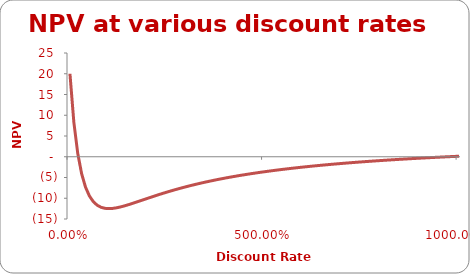
| Category | NPV |
|---|---|
| 0.0 | 20000 |
| 0.1 | 8343.351 |
| 0.2 | 833.333 |
| 0.30000000000000004 | -4080.564 |
| 0.4 | -7317.784 |
| 0.5 | -9444.444 |
| 0.6 | -10820.313 |
| 0.7 | -11680.236 |
| 0.7999999999999999 | -12181.07 |
| 0.8999999999999999 | -12429.654 |
| 0.9999999999999999 | -12500 |
| 1.0999999999999999 | -12444.121 |
| 1.2 | -12299.023 |
| 1.3 | -12091.313 |
| 1.4000000000000001 | -11840.278 |
| 1.5000000000000002 | -11560 |
| 1.6000000000000003 | -11260.81 |
| 1.7000000000000004 | -10950.312 |
| 1.8000000000000005 | -10634.111 |
| 1.9000000000000006 | -10316.331 |
| 2.0000000000000004 | -10000 |
| 2.1000000000000005 | -9687.322 |
| 2.2000000000000006 | -9379.883 |
| 2.3000000000000007 | -9078.805 |
| 2.400000000000001 | -8784.857 |
| 2.500000000000001 | -8498.542 |
| 2.600000000000001 | -8220.165 |
| 2.700000000000001 | -7949.875 |
| 2.800000000000001 | -7687.71 |
| 2.9000000000000012 | -7433.622 |
| 3.0000000000000013 | -7187.5 |
| 3.1000000000000014 | -6949.188 |
| 3.2000000000000015 | -6718.497 |
| 3.3000000000000016 | -6495.214 |
| 3.4000000000000017 | -6279.113 |
| 3.5000000000000018 | -6069.959 |
| 3.600000000000002 | -5867.51 |
| 3.700000000000002 | -5671.528 |
| 3.800000000000002 | -5481.771 |
| 3.900000000000002 | -5298.005 |
| 4.000000000000002 | -5120 |
| 4.100000000000001 | -4947.531 |
| 4.200000000000001 | -4780.382 |
| 4.300000000000001 | -4618.343 |
| 4.4 | -4461.21 |
| 4.5 | -4308.79 |
| 4.6 | -4160.897 |
| 4.699999999999999 | -4017.349 |
| 4.799999999999999 | -3877.978 |
| 4.899999999999999 | -3742.617 |
| 4.999999999999998 | -3611.111 |
| 5.099999999999998 | -3483.309 |
| 5.1999999999999975 | -3359.068 |
| 5.299999999999997 | -3238.251 |
| 5.399999999999997 | -3120.728 |
| 5.4999999999999964 | -3006.372 |
| 5.599999999999996 | -2895.066 |
| 5.699999999999996 | -2786.696 |
| 5.799999999999995 | -2681.152 |
| 5.899999999999995 | -2578.331 |
| 5.999999999999995 | -2478.134 |
| 6.099999999999994 | -2380.466 |
| 6.199999999999994 | -2285.237 |
| 6.299999999999994 | -2192.359 |
| 6.399999999999993 | -2101.751 |
| 6.499999999999993 | -2013.333 |
| 6.5999999999999925 | -1927.03 |
| 6.699999999999992 | -1842.769 |
| 6.799999999999992 | -1760.481 |
| 6.8999999999999915 | -1680.1 |
| 6.999999999999991 | -1601.563 |
| 7.099999999999991 | -1524.807 |
| 7.19999999999999 | -1449.776 |
| 7.29999999999999 | -1376.413 |
| 7.39999999999999 | -1304.665 |
| 7.499999999999989 | -1234.48 |
| 7.599999999999989 | -1165.809 |
| 7.699999999999989 | -1098.605 |
| 7.799999999999988 | -1032.823 |
| 7.899999999999988 | -968.418 |
| 7.999999999999988 | -905.35 |
| 8.099999999999987 | -843.577 |
| 8.199999999999987 | -783.061 |
| 8.299999999999986 | -723.764 |
| 8.399999999999986 | -665.652 |
| 8.499999999999986 | -608.689 |
| 8.599999999999985 | -552.843 |
| 8.699999999999985 | -498.081 |
| 8.799999999999985 | -444.373 |
| 8.899999999999984 | -391.689 |
| 8.999999999999984 | -340 |
| 9.099999999999984 | -289.28 |
| 9.199999999999983 | -239.501 |
| 9.299999999999983 | -190.638 |
| 9.399999999999983 | -142.666 |
| 9.499999999999982 | -95.562 |
| 9.599999999999982 | -49.302 |
| 9.699999999999982 | -3.865 |
| 9.799999999999981 | 40.771 |
| 9.89999999999998 | 84.627 |
| 9.99999999999998 | 127.724 |